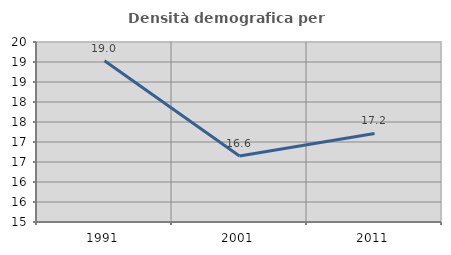
| Category | Densità demografica |
|---|---|
| 1991.0 | 19.029 |
| 2001.0 | 16.648 |
| 2011.0 | 17.213 |